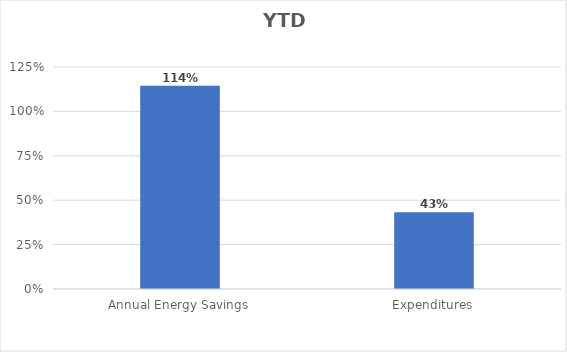
| Category | Series 0 |
|---|---|
| Annual Energy Savings | 1.144 |
| Expenditures | 0.432 |